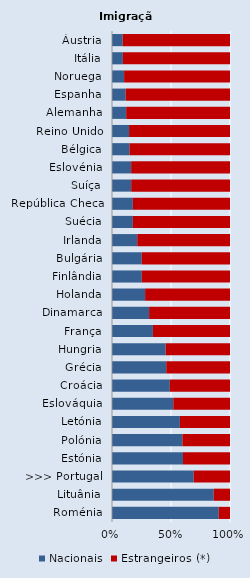
| Category | Nacionais | Estrangeiros (*) |
|---|---|---|
| Áustria | 9.068 | 90.932 |
| Itália | 9.248 | 90.752 |
| Noruega | 10.256 | 89.744 |
| Espanha | 11.547 | 88.453 |
| Alemanha | 12.015 | 87.985 |
| Reino Unido | 14.473 | 85.527 |
| Bélgica | 14.825 | 85.175 |
| Eslovénia | 16.221 | 83.779 |
| Suíça | 16.268 | 83.732 |
| República Checa | 17.68 | 82.32 |
| Suécia | 17.682 | 82.318 |
| Irlanda | 21.41 | 78.59 |
| Bulgária | 25.213 | 74.787 |
| Finlândia | 25.259 | 74.741 |
| Holanda | 28.061 | 71.939 |
| Dinamarca | 31.453 | 68.547 |
| França | 34.693 | 65.307 |
| Hungria | 45.468 | 54.532 |
| Grécia | 45.981 | 54.019 |
| Croácia | 48.998 | 51.002 |
| Eslováquia | 51.932 | 48.068 |
| Letónia | 57.525 | 42.475 |
| Polónia | 59.657 | 40.343 |
| Estónia | 60.161 | 39.839 |
| >>> Portugal | 69.249 | 30.751 |
| Lituânia | 86.207 | 13.793 |
| Roménia | 90.418 | 9.582 |